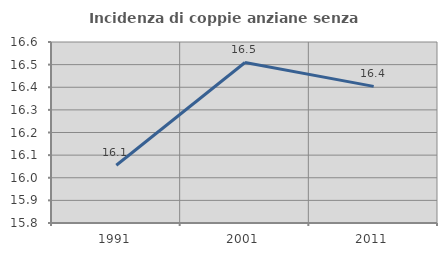
| Category | Incidenza di coppie anziane senza figli  |
|---|---|
| 1991.0 | 16.055 |
| 2001.0 | 16.509 |
| 2011.0 | 16.404 |